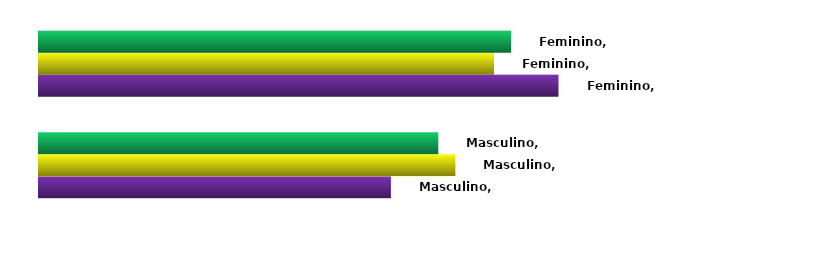
| Category | Concluintes | Matriculados | Ingressantes |
|---|---|---|---|
| Masculino | 0.404 | 0.478 | 0.458 |
| Feminino | 0.596 | 0.522 | 0.542 |